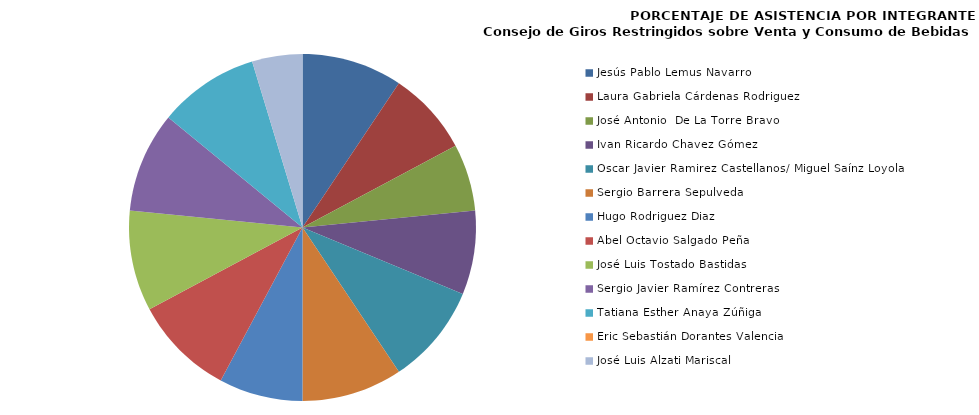
| Category | Series 0 |
|---|---|
| Jesús Pablo Lemus Navarro | 100 |
| Laura Gabriela Cárdenas Rodriguez | 83.333 |
| José Antonio  De La Torre Bravo | 66.667 |
| Ivan Ricardo Chavez Gómez | 83.333 |
| Oscar Javier Ramirez Castellanos/ Miguel Saínz Loyola | 100 |
| Sergio Barrera Sepulveda | 100 |
| Hugo Rodriguez Diaz | 83.333 |
| Abel Octavio Salgado Peña | 100 |
| José Luis Tostado Bastidas  | 100 |
| Sergio Javier Ramírez Contreras | 100 |
| Tatiana Esther Anaya Zúñiga | 100 |
| Eric Sebastián Dorantes Valencia | 0 |
| José Luis Alzati Mariscal | 50 |